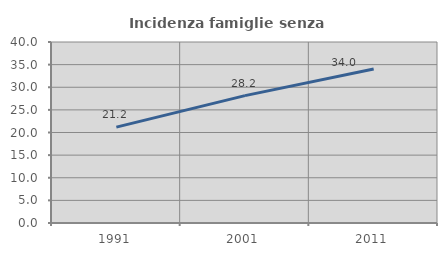
| Category | Incidenza famiglie senza nuclei |
|---|---|
| 1991.0 | 21.185 |
| 2001.0 | 28.151 |
| 2011.0 | 34.023 |